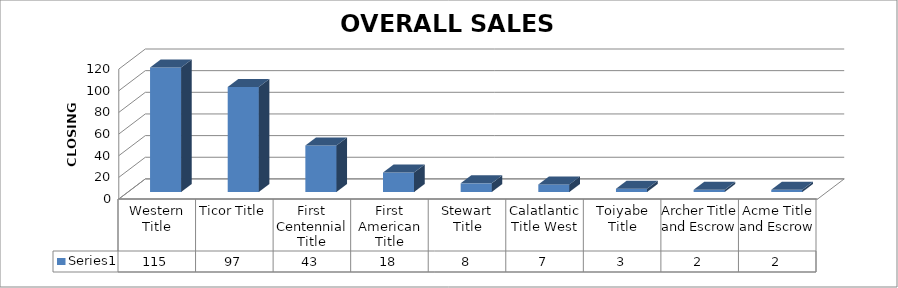
| Category | Series 0 |
|---|---|
| Western Title | 115 |
| Ticor Title | 97 |
| First Centennial Title | 43 |
| First American Title | 18 |
| Stewart Title | 8 |
| Calatlantic Title West | 7 |
| Toiyabe Title | 3 |
| Archer Title and Escrow | 2 |
| Acme Title and Escrow | 2 |